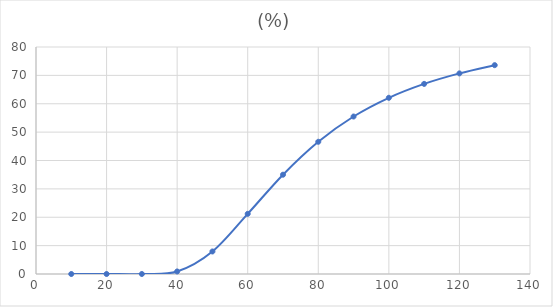
| Category | (%) |
|---|---|
| 10.0 | 0 |
| 20.0 | 0 |
| 30.0 | 0.003 |
| 40.0 | 0.9 |
| 50.0 | 7.94 |
| 60.0 | 21.2 |
| 70.0 | 35 |
| 80.0 | 46.6 |
| 90.0 | 55.5 |
| 100.0 | 62.1 |
| 110.0 | 67 |
| 120.0 | 70.7 |
| 130.0 | 73.6 |